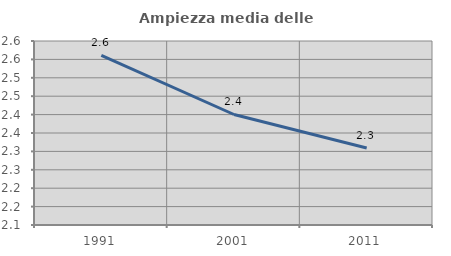
| Category | Ampiezza media delle famiglie |
|---|---|
| 1991.0 | 2.561 |
| 2001.0 | 2.4 |
| 2011.0 | 2.309 |